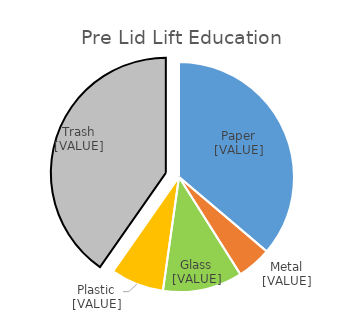
| Category | Series 0 |
|---|---|
| Paper | 0.362 |
| Metals | 0.049 |
| Glass | 0.112 |
| Plastic | 0.075 |
| Trash  | 0.403 |